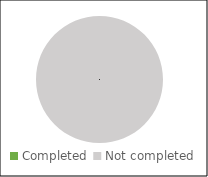
| Category | Technical |
|---|---|
| Completed  | 0 |
| Not completed | 1 |